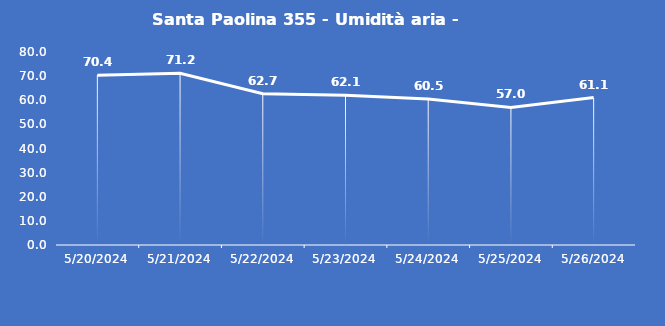
| Category | Santa Paolina 355 - Umidità aria - Grezzo (%) |
|---|---|
| 5/20/24 | 70.4 |
| 5/21/24 | 71.2 |
| 5/22/24 | 62.7 |
| 5/23/24 | 62.1 |
| 5/24/24 | 60.5 |
| 5/25/24 | 57 |
| 5/26/24 | 61.1 |